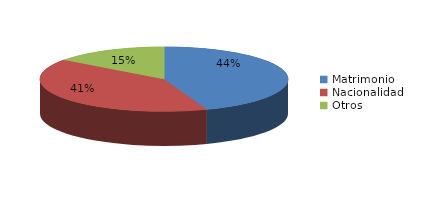
| Category | Series 0 |
|---|---|
| Matrimonio | 2183 |
| Nacionalidad | 1999 |
| Otros | 731 |